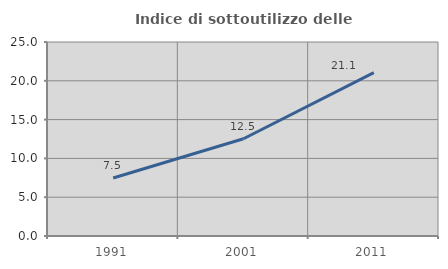
| Category | Indice di sottoutilizzo delle abitazioni  |
|---|---|
| 1991.0 | 7.471 |
| 2001.0 | 12.532 |
| 2011.0 | 21.053 |